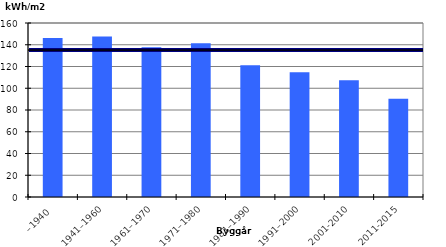
| Category | Genomsnitt per byggår (KWh/m2) |
|---|---|
| –1940 | 146.1 |
| 1941–1960 | 147.668 |
| 1961–1970 | 137.757 |
| 1971–1980 | 141.311 |
| 1981–1990 | 121.22 |
| 1991–2000 | 114.721 |
| 2001-2010 | 107.378 |
| 2011-2015 | 90.382 |